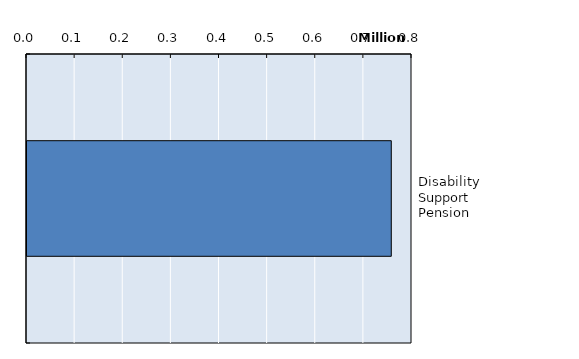
| Category | Series 0 |
|---|---|
| Disability Support Pension | 756960 |